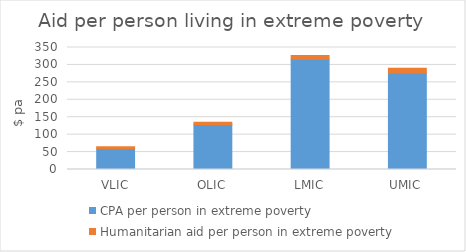
| Category | CPA per person in extreme poverty | Humanitarian aid per person in extreme poverty  |
|---|---|---|
| VLIC | 60.179 | 5.407 |
| OLIC | 129.331 | 6.481 |
| LMIC | 316.039 | 10.782 |
| UMIC | 276.903 | 13.351 |